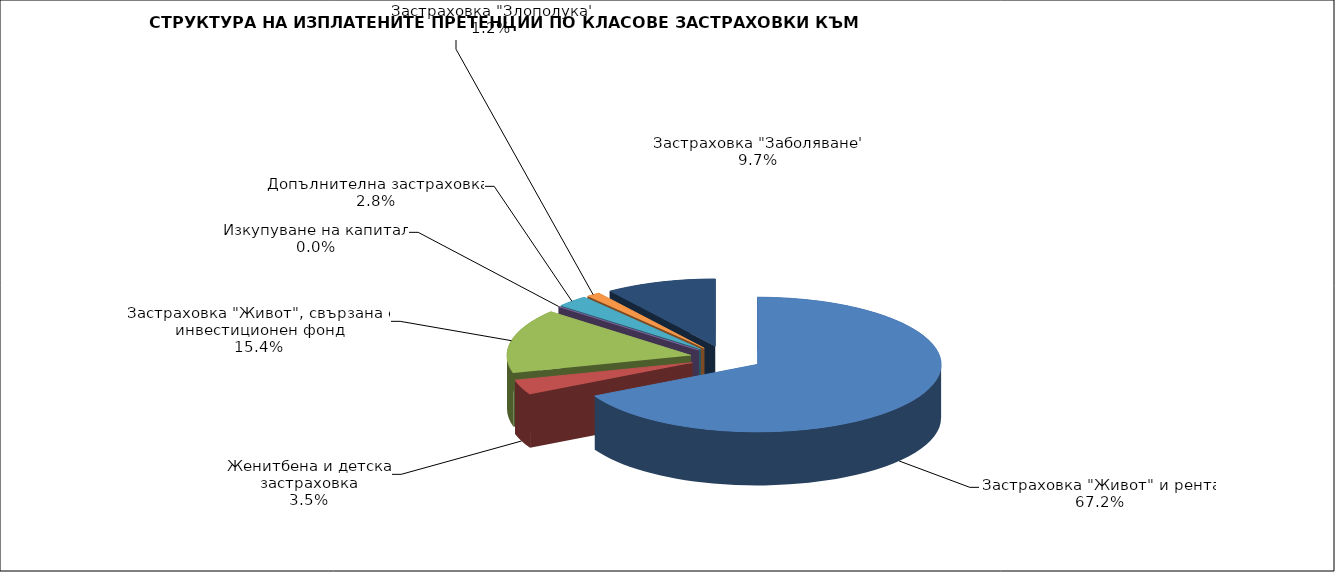
| Category | 19 461 508 |
|---|---|
| Застраховка "Живот" и рента | 19461507.895 |
| Женитбена и детска застраховка | 1027190.832 |
| Застраховка "Живот", свързана с инвестиционен фонд | 4466745.89 |
| Изкупуване на капитал | 0 |
| Допълнителна застраховка | 820067.556 |
| Застраховка "Злополука" | 351033.42 |
| Застраховка "Заболяване" | 2816117.19 |